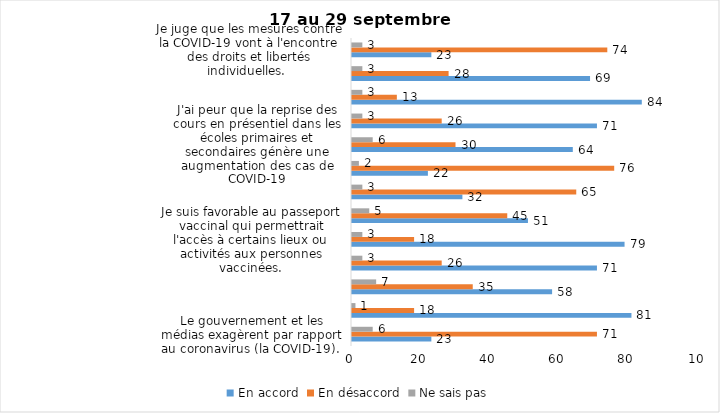
| Category | En accord | En désaccord | Ne sais pas |
|---|---|---|---|
| Le gouvernement et les médias exagèrent par rapport au coronavirus (la COVID-19). | 23 | 71 | 6 |
| J’ai peur que le système de santé soit débordé par les cas de COVID-19. | 81 | 18 | 1 |
| J’ai peur que la reprise des cours en présentiel dans les cégeps et les universités génère une augmentation des cas de COVID-19. | 58 | 35 | 7 |
| Je suis inquiet/inquiète  que le nombre de cas augmente en raison des nouveaux variants du virus de la COVID-19 | 71 | 26 | 3 |
| Je suis favorable au passeport vaccinal qui permettrait l'accès à certains lieux ou activités aux personnes vaccinées. | 79 | 18 | 3 |
| Si les cas de COVID-19 augmentent cet automne, je suis favorable à la mise en place de mesures de confinement (ex. fermeture de services non essentiels, interdiction des rassemblements privés) | 51 | 45 | 5 |
| Je suis favorable à ce que le port du masque ne soit plus obligatoire au Québec. | 32 | 65 | 3 |
| Étant donné la progression de la vaccination, je pense qu’il est moins important de suivre les mesures de prévention. | 22 | 76 | 2 |
| J'ai peur que la reprise des cours en présentiel dans les écoles primaires et secondaires génère une augmentation des cas de COVID-19 | 64 | 30 | 6 |
| Je suis favorable à ce qu’il y ait des sanctions aux commerçants qui ne vérifieront pas le passeport vaccinal (code QR) de leurs clients | 71 | 26 | 3 |
| Je suis favorable à ce qu’il y ait des sanctions aux gens qui tenteront de frauder leur passeport vaccinal par des amendes ou des accusations criminelles. | 84 | 13 | 3 |
| Je crois que le passeport vaccinal devrait être requis pour davantage de services et commerces (ex. : spas, centre d’achats, centre de soins personnels. | 69 | 28 | 3 |
| Je juge que les mesures contre la COVID-19 vont à l'encontre des droits et libertés individuelles.  | 23 | 74 | 3 |